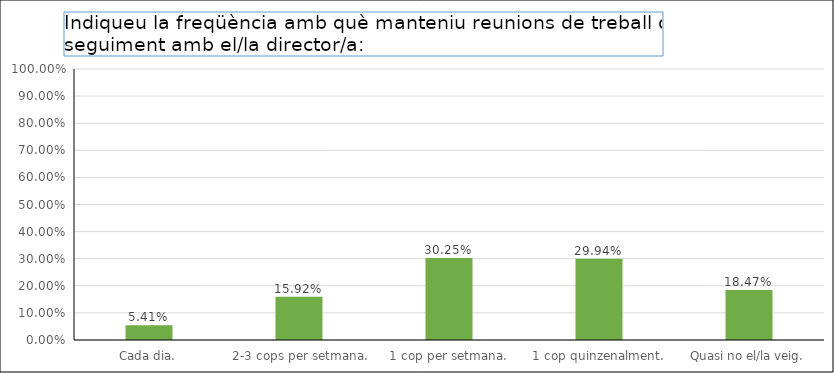
| Category | Series 0 |
|---|---|
| Cada dia. | 0.054 |
|  2-3 cops per setmana. | 0.159 |
| 1 cop per setmana. | 0.302 |
| 1 cop quinzenalment. | 0.299 |
| Quasi no el/la veig. | 0.185 |